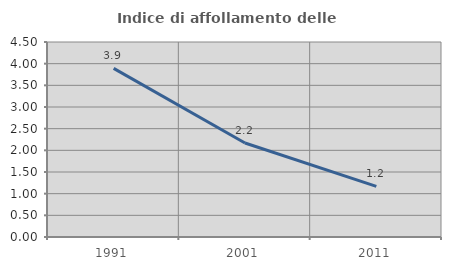
| Category | Indice di affollamento delle abitazioni  |
|---|---|
| 1991.0 | 3.89 |
| 2001.0 | 2.169 |
| 2011.0 | 1.169 |